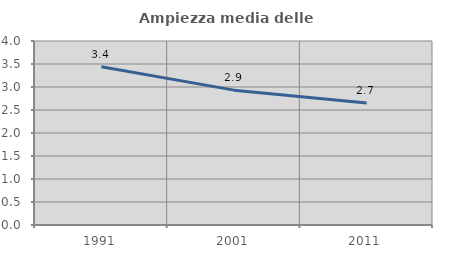
| Category | Ampiezza media delle famiglie |
|---|---|
| 1991.0 | 3.441 |
| 2001.0 | 2.932 |
| 2011.0 | 2.652 |